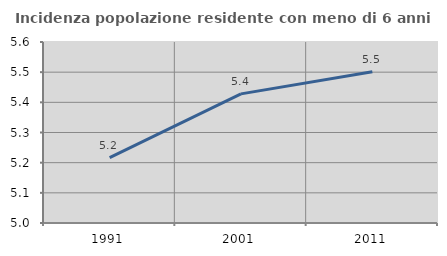
| Category | Incidenza popolazione residente con meno di 6 anni |
|---|---|
| 1991.0 | 5.217 |
| 2001.0 | 5.428 |
| 2011.0 | 5.502 |